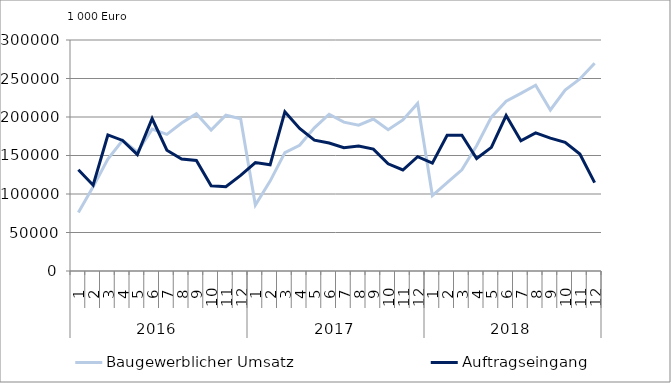
| Category | Baugewerblicher Umsatz | Auftragseingang |
|---|---|---|
| 0 | 76043.538 | 131571.482 |
| 1 | 109483.268 | 111467.248 |
| 2 | 145343.559 | 176673.268 |
| 3 | 169660.551 | 169566.96 |
| 4 | 154554.865 | 151228.165 |
| 5 | 184236.137 | 198035.655 |
| 6 | 177444.278 | 156900.898 |
| 7 | 192230.472 | 145537.167 |
| 8 | 204178.065 | 143616.217 |
| 9 | 183173.849 | 110770.94 |
| 10 | 202302.279 | 109384.188 |
| 11 | 197832.096 | 124193.91 |
| 12 | 85701.947 | 140751.008 |
| 13 | 116743.276 | 137863.383 |
| 14 | 153810.055 | 206710.579 |
| 15 | 163342.989 | 185183.797 |
| 16 | 185946.221 | 169878.51 |
| 17 | 203627.91 | 166148.392 |
| 18 | 193377.256 | 160134.206 |
| 19 | 189429.952 | 162221.206 |
| 20 | 197405.279 | 158305.285 |
| 21 | 183450.026 | 139156.761 |
| 22 | 196209.214 | 131165.419 |
| 23 | 217688.447 | 148434.901 |
| 24 | 97959.056 | 140119.385 |
| 25 | 114756.787 | 176330.213 |
| 26 | 131454.642 | 176241.061 |
| 27 | 162648.053 | 146063.407 |
| 28 | 199809.407 | 160551.931 |
| 29 | 220535.974 | 201835.846 |
| 30 | 230672.472 | 169132.23 |
| 31 | 241233.619 | 179396.293 |
| 32 | 209099.292 | 172542.764 |
| 33 | 234953.007 | 166991.729 |
| 34 | 249410.043 | 151835.629 |
| 35 | 269773.227 | 114807.456 |